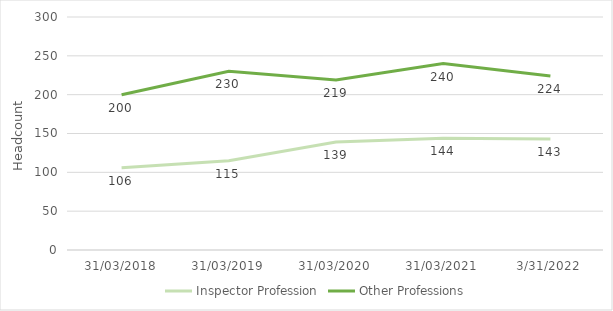
| Category | Inspector Profession | Other Professions |
|---|---|---|
| 31/03/2018 | 106 | 200 |
| 31/03/2019 | 115 | 230 |
| 31/03/2020 | 139 | 219 |
| 31/03/2021 | 144 | 240 |
| 31/03/2022 | 143 | 224 |